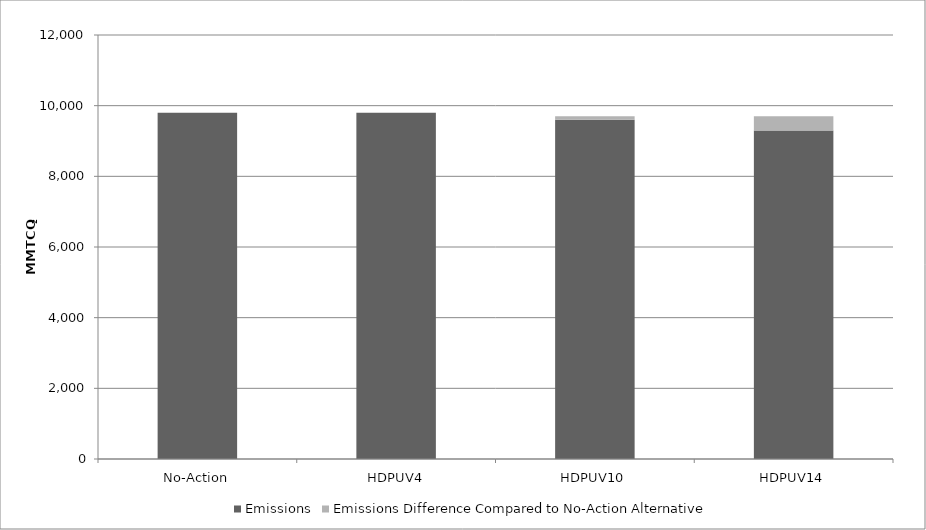
| Category | Emissions | Emissions Difference Compared to No-Action Alternative |
|---|---|---|
| No-Action | 9800 | 0 |
| HDPUV4 | 9800 | 0 |
| HDPUV10 | 9600 | 100 |
| HDPUV14 | 9300 | 400 |